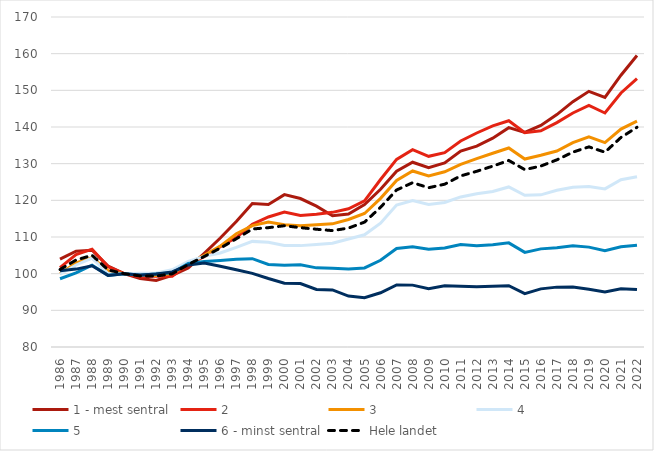
| Category | 1 - mest sentral | 2 | 3 | 4 | 5 | 6 - minst sentral | Hele landet |
|---|---|---|---|---|---|---|---|
| 1986.0 | 103.96 | 101.643 | 99.97 | 99.835 | 98.621 | 100.766 | 101.131 |
| 1987.0 | 106.139 | 105.22 | 102.939 | 102.366 | 100.208 | 101.242 | 103.725 |
| 1988.0 | 106.4 | 106.681 | 104.346 | 104.238 | 102.31 | 102.136 | 105.011 |
| 1989.0 | 102.089 | 101.899 | 100.786 | 100.027 | 99.541 | 99.53 | 101.026 |
| 1990.0 | 100 | 100 | 100 | 100 | 100 | 100 | 100 |
| 1991.0 | 98.685 | 99.063 | 99.675 | 100.128 | 99.56 | 99.667 | 99.365 |
| 1992.0 | 98.15 | 99.384 | 99.484 | 100.202 | 99.883 | 99.912 | 99.343 |
| 1993.0 | 99.522 | 99.301 | 100.065 | 101.061 | 100.241 | 100.461 | 99.951 |
| 1994.0 | 101.55 | 102.574 | 102.66 | 103.363 | 102.767 | 102.388 | 102.499 |
| 1995.0 | 105.555 | 104.627 | 105.03 | 104.717 | 103.304 | 102.92 | 104.699 |
| 1996.0 | 109.725 | 107.376 | 107.517 | 105.654 | 103.561 | 102.017 | 106.959 |
| 1997.0 | 114.246 | 109.83 | 110.902 | 107.174 | 103.903 | 101.046 | 109.518 |
| 1998.0 | 119.104 | 113.459 | 113.115 | 108.803 | 104.096 | 100.092 | 112.177 |
| 1999.0 | 118.865 | 115.459 | 114.06 | 108.594 | 102.525 | 98.694 | 112.55 |
| 2000.0 | 121.562 | 116.787 | 113.329 | 107.713 | 102.285 | 97.418 | 113.071 |
| 2001.0 | 120.492 | 115.853 | 113.04 | 107.648 | 102.456 | 97.29 | 112.546 |
| 2002.0 | 118.409 | 116.212 | 113.366 | 107.967 | 101.586 | 95.675 | 112.118 |
| 2003.0 | 115.79 | 116.724 | 113.586 | 108.283 | 101.449 | 95.556 | 111.747 |
| 2004.0 | 116.267 | 117.704 | 114.779 | 109.462 | 101.291 | 93.89 | 112.428 |
| 2005.0 | 118.856 | 119.848 | 116.417 | 110.615 | 101.553 | 93.449 | 114.063 |
| 2006.0 | 123.008 | 125.684 | 120.545 | 113.779 | 103.662 | 94.794 | 118.1 |
| 2007.0 | 127.963 | 131.171 | 125.42 | 118.721 | 106.863 | 96.922 | 122.823 |
| 2008.0 | 130.391 | 133.815 | 128.012 | 119.946 | 107.35 | 96.875 | 124.816 |
| 2009.0 | 128.89 | 132.001 | 126.628 | 118.842 | 106.639 | 95.891 | 123.437 |
| 2010.0 | 130.203 | 133.013 | 127.786 | 119.431 | 106.993 | 96.712 | 124.403 |
| 2011.0 | 133.42 | 136.176 | 129.833 | 120.923 | 107.95 | 96.598 | 126.659 |
| 2012.0 | 134.785 | 138.364 | 131.354 | 121.788 | 107.627 | 96.452 | 127.922 |
| 2013.0 | 136.954 | 140.31 | 132.851 | 122.395 | 107.862 | 96.546 | 129.329 |
| 2014.0 | 139.814 | 141.714 | 134.269 | 123.644 | 108.407 | 96.702 | 130.871 |
| 2015.0 | 138.539 | 138.432 | 131.257 | 121.394 | 105.811 | 94.569 | 128.38 |
| 2016.0 | 140.444 | 138.973 | 132.28 | 121.504 | 106.763 | 95.851 | 129.346 |
| 2017.0 | 143.387 | 141.192 | 133.439 | 122.761 | 107.086 | 96.328 | 131.043 |
| 2018.0 | 146.908 | 143.817 | 135.715 | 123.554 | 107.644 | 96.38 | 133.146 |
| 2019.0 | 149.722 | 145.872 | 137.334 | 123.748 | 107.241 | 95.774 | 134.579 |
| 2020.0 | 148.082 | 143.823 | 135.748 | 123.119 | 106.28 | 95.035 | 133.126 |
| 2021.0 | 154.127 | 149.283 | 139.434 | 125.611 | 107.335 | 95.905 | 137.146 |
| 2022.0 | 159.505 | 153.217 | 141.61 | 126.427 | 107.763 | 95.655 | 139.926 |